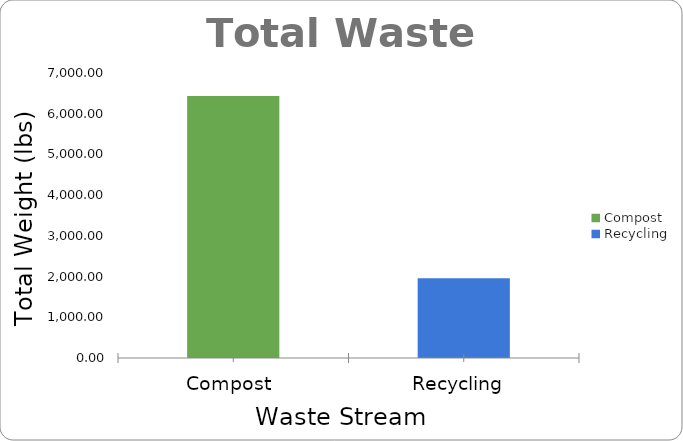
| Category | TOTALS  |
|---|---|
| Compost  | 6435.1 |
| Recycling  | 1959.3 |